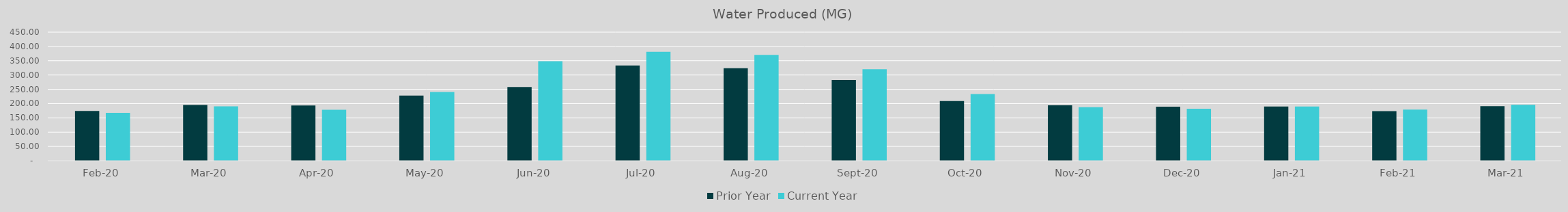
| Category | Prior Year | Current Year |
|---|---|---|
| 2020-02-01 | 173.847 | 167.532 |
| 2020-03-01 | 195.333 | 190.306 |
| 2020-04-01 | 193.551 | 178.22 |
| 2020-05-01 | 228.091 | 240.625 |
| 2020-06-01 | 257.9 | 348.57 |
| 2020-07-01 | 333.37 | 381.34 |
| 2020-08-01 | 323.49 | 370.12 |
| 2020-09-01 | 282.53 | 320.39 |
| 2020-10-01 | 208.72 | 233.34 |
| 2020-11-01 | 193.92 | 187.14 |
| 2020-12-01 | 188.86 | 182.02 |
| 2021-01-01 | 189.94 | 189.96 |
| 2021-02-01 | 173.75 | 178.97 |
| 2021-03-01 | 190.77 | 195.96 |